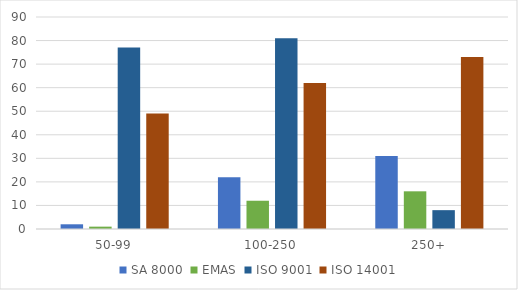
| Category | SA 8000 | EMAS | ISO 9001 | ISO 14001 |
|---|---|---|---|---|
| 50-99 | 2 | 1 | 77 | 49 |
| 100-250 | 22 | 12 | 81 | 62 |
| 250+ | 31 | 16 | 8 | 73 |